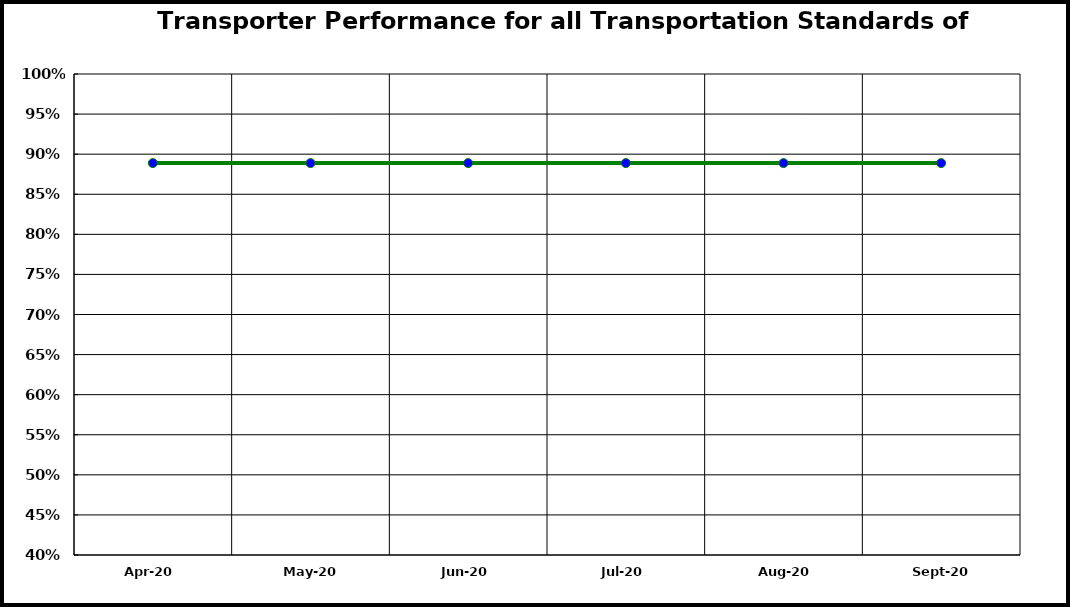
| Category | Performance |
|---|---|
| 2020-04-01 | 0.889 |
| 2020-05-01 | 0.889 |
| 2020-06-01 | 0.889 |
| 2020-07-01 | 0.889 |
| 2020-08-01 | 0.889 |
| 2020-09-01 | 0.889 |